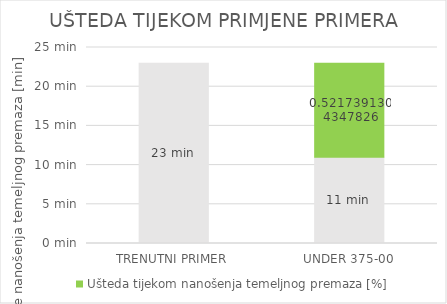
| Category | Vrijeme nanošenja temeljnog premaza [min] | Ušteda tijekom nanošenja temeljnog premaza [%] |
|---|---|---|
| TRENUTNI PRIMER | 23 | 0 |
| UNDER 375-00 | 11 | 12 |